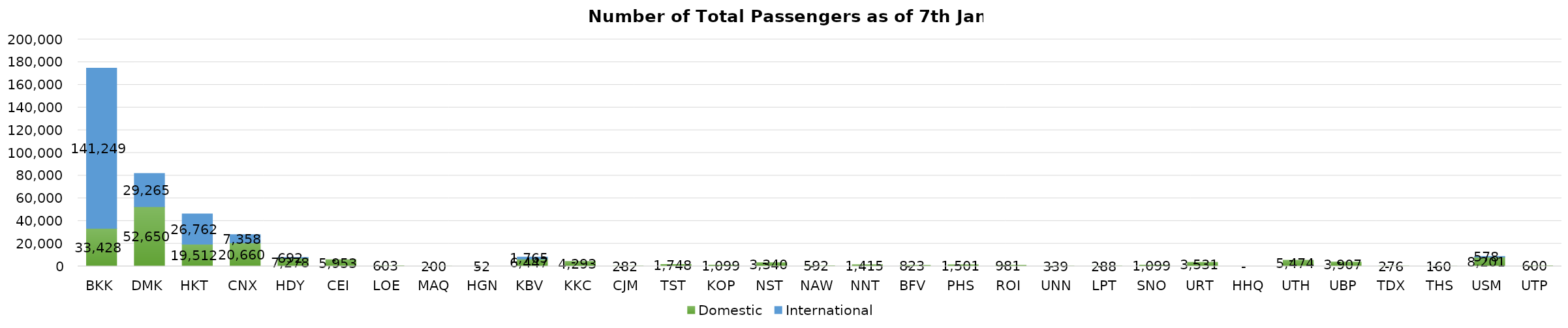
| Category | Domestic | International |
|---|---|---|
| BKK | 33428 | 141249 |
| DMK | 52650 | 29265 |
| HKT | 19512 | 26762 |
| CNX | 20660 | 7358 |
| HDY | 7278 | 692 |
| CEI | 5953 | 0 |
| LOE | 603 | 0 |
| MAQ | 200 | 0 |
| HGN | 52 | 0 |
| KBV | 6447 | 1765 |
| KKC | 4293 | 0 |
| CJM | 282 | 0 |
| TST | 1748 | 0 |
| KOP | 1099 | 0 |
| NST | 3340 | 0 |
| NAW | 592 | 0 |
| NNT | 1415 | 0 |
| BFV | 823 | 0 |
| PHS | 1501 | 0 |
| ROI | 981 | 0 |
| UNN | 339 | 0 |
| LPT | 288 | 0 |
| SNO | 1099 | 0 |
| URT | 3531 | 0 |
| HHQ | 0 | 0 |
| UTH | 5474 | 0 |
| UBP | 3907 | 0 |
| TDX | 276 | 0 |
| THS | 160 | 0 |
| USM | 8201 | 578 |
| UTP | 600 | 0 |